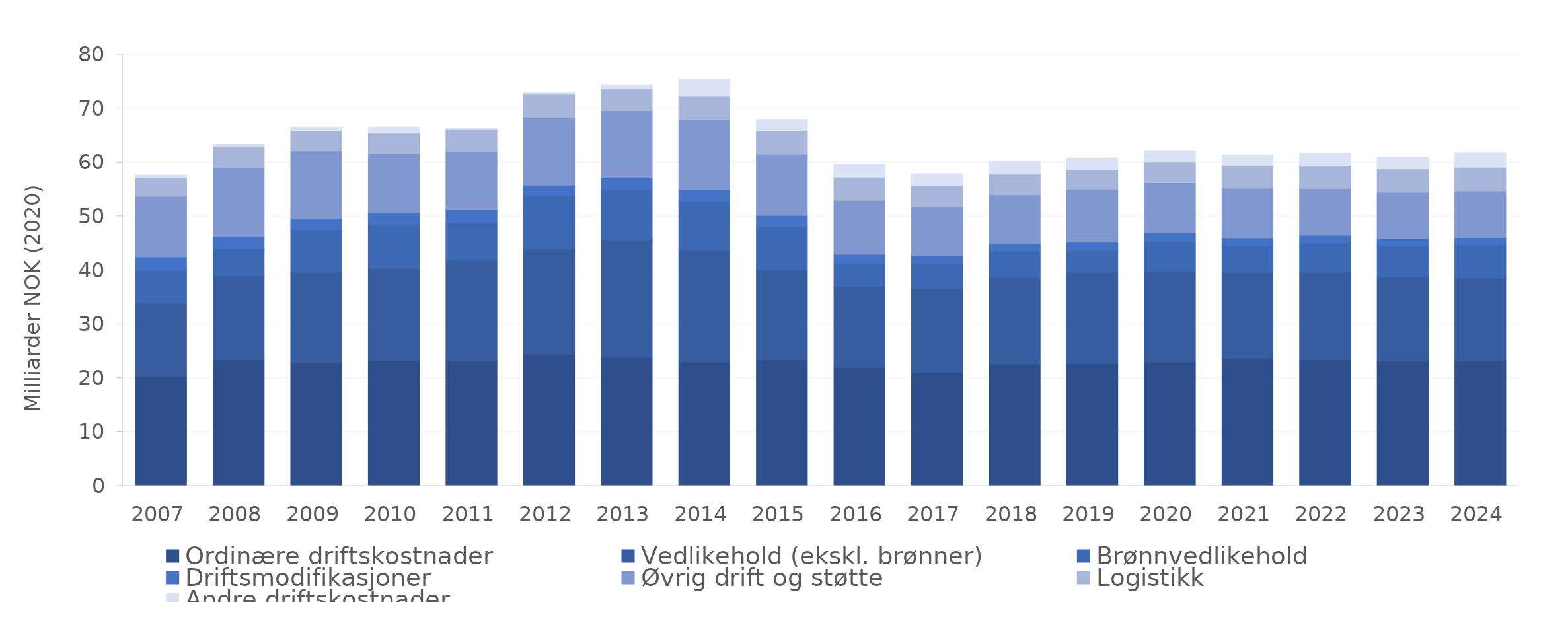
| Category | Ordinære driftskostnader | Vedlikehold (ekskl. brønner) | Brønnvedlikehold | Driftsmodifikasjoner | Øvrig drift og støtte | Logistikk | Andre driftskostnader |
|---|---|---|---|---|---|---|---|
| 2007.0 | 20.339 | 13.56 | 6.076 | 2.474 | 11.283 | 3.401 | 0.502 |
| 2008.0 | 23.34 | 15.626 | 5.023 | 2.304 | 12.744 | 3.977 | 0.338 |
| 2009.0 | 22.857 | 16.736 | 7.904 | 2.034 | 12.56 | 3.817 | 0.631 |
| 2010.0 | 23.204 | 17.195 | 8.115 | 2.191 | 10.908 | 3.772 | 1.164 |
| 2011.0 | 23.241 | 18.577 | 6.946 | 2.453 | 10.779 | 4.074 | 0.204 |
| 2012.0 | 24.424 | 19.565 | 9.745 | 2.031 | 12.462 | 4.378 | 0.395 |
| 2013.0 | 23.759 | 21.775 | 9.352 | 2.197 | 12.508 | 3.993 | 0.848 |
| 2014.0 | 22.999 | 20.743 | 8.951 | 2.297 | 12.899 | 4.326 | 3.16 |
| 2015.0 | 23.332 | 16.726 | 8.08 | 2.013 | 11.381 | 4.379 | 2.05 |
| 2016.0 | 21.969 | 15.014 | 4.344 | 1.627 | 9.99 | 4.303 | 2.411 |
| 2017.0 | 21.005 | 15.531 | 4.712 | 1.461 | 9.037 | 3.958 | 2.172 |
| 2018.0 | 22.579 | 16.062 | 4.947 | 1.357 | 9.066 | 3.797 | 2.449 |
| 2019.0 | 22.705 | 16.924 | 3.987 | 1.546 | 9.872 | 3.623 | 2.141 |
| 2020.0 | 22.999 | 16.878 | 5.413 | 1.735 | 9.203 | 3.895 | 2.038 |
| 2021.0 | 23.664 | 15.983 | 4.923 | 1.332 | 9.281 | 4.101 | 2.111 |
| 2022.0 | 23.327 | 16.255 | 5.48 | 1.443 | 8.637 | 4.275 | 2.223 |
| 2023.0 | 23.127 | 15.627 | 5.674 | 1.389 | 8.625 | 4.343 | 2.199 |
| 2024.0 | 23.182 | 15.337 | 6.166 | 1.394 | 8.631 | 4.378 | 2.714 |